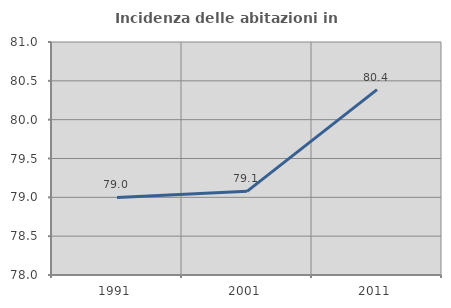
| Category | Incidenza delle abitazioni in proprietà  |
|---|---|
| 1991.0 | 78.998 |
| 2001.0 | 79.077 |
| 2011.0 | 80.388 |